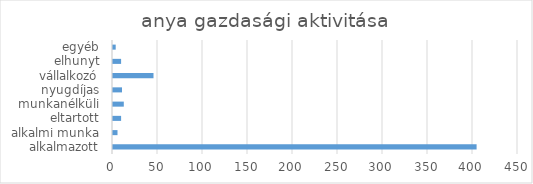
| Category | Series 0 |
|---|---|
| alkalmazott | 404 |
| alkalmi munka | 5 |
| eltartott | 9 |
| munkanélküli | 12 |
| nyugdíjas | 10 |
| vállalkozó | 45 |
| elhunyt | 9 |
| egyéb | 3 |